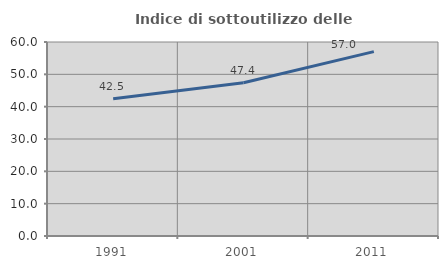
| Category | Indice di sottoutilizzo delle abitazioni  |
|---|---|
| 1991.0 | 42.459 |
| 2001.0 | 47.409 |
| 2011.0 | 57.028 |